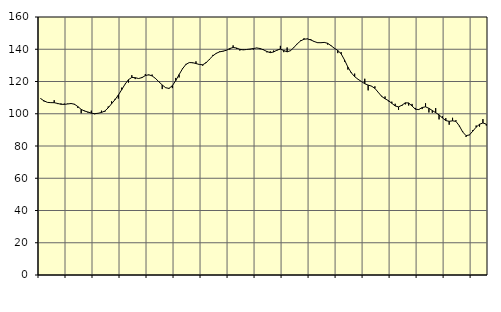
| Category | Piggar | Series 1 |
|---|---|---|
| nan | 109.6 | 109.36 |
| 87.0 | 107.6 | 107.99 |
| 87.0 | 107 | 107.05 |
| 87.0 | 107 | 106.88 |
| nan | 108.4 | 106.86 |
| 88.0 | 106 | 106.39 |
| 88.0 | 106.4 | 105.88 |
| 88.0 | 106.3 | 105.81 |
| nan | 106.3 | 106.06 |
| 89.0 | 106.6 | 106.34 |
| 89.0 | 105.6 | 105.93 |
| 89.0 | 103.6 | 104.45 |
| nan | 100.3 | 102.7 |
| 90.0 | 101.9 | 101.67 |
| 90.0 | 100.7 | 101.09 |
| 90.0 | 101.9 | 100.37 |
| nan | 99.7 | 100.04 |
| 91.0 | 100.2 | 100.3 |
| 91.0 | 101.9 | 100.79 |
| 91.0 | 101.2 | 101.69 |
| nan | 104.5 | 103.66 |
| 92.0 | 107.7 | 106.22 |
| 92.0 | 109.2 | 108.7 |
| 92.0 | 109.4 | 111.6 |
| nan | 116.2 | 114.93 |
| 93.0 | 118.5 | 118.37 |
| 93.0 | 119.3 | 121.13 |
| 93.0 | 123.9 | 122.52 |
| nan | 121.5 | 122.36 |
| 94.0 | 121.9 | 121.84 |
| 94.0 | 122.8 | 122.42 |
| 94.0 | 124.6 | 123.65 |
| nan | 123.9 | 124.18 |
| 95.0 | 124.3 | 123.46 |
| 95.0 | 122.1 | 121.9 |
| 95.0 | 120.1 | 119.84 |
| nan | 115.3 | 117.86 |
| 96.0 | 116.3 | 116.16 |
| 96.0 | 115.4 | 115.72 |
| 96.0 | 115.9 | 117.42 |
| nan | 122.2 | 120.57 |
| 97.0 | 122.5 | 124.3 |
| 97.0 | 128.2 | 127.85 |
| 97.0 | 130.9 | 130.55 |
| nan | 131.7 | 131.74 |
| 98.0 | 131.4 | 131.66 |
| 98.0 | 132.5 | 131.15 |
| 98.0 | 130.6 | 130.54 |
| nan | 129.8 | 130.38 |
| 99.0 | 132.1 | 131.62 |
| 99.0 | 133.5 | 133.83 |
| 99.0 | 136.5 | 135.92 |
| nan | 137.2 | 137.48 |
| 0.0 | 138.7 | 138.39 |
| 0.0 | 138.6 | 138.81 |
| 0.0 | 139.5 | 139.37 |
| nan | 139.8 | 140.42 |
| 1.0 | 142.4 | 141.12 |
| 1.0 | 140.2 | 140.77 |
| 1.0 | 139.2 | 139.95 |
| nan | 140 | 139.63 |
| 2.0 | 139.8 | 139.86 |
| 2.0 | 139.9 | 140.11 |
| 2.0 | 139.8 | 140.46 |
| nan | 140.9 | 140.78 |
| 3.0 | 140 | 140.46 |
| 3.0 | 140 | 139.64 |
| 3.0 | 138.1 | 138.61 |
| nan | 138.7 | 137.9 |
| 4.0 | 139.2 | 138.3 |
| 4.0 | 139.2 | 139.49 |
| 4.0 | 142.1 | 140.1 |
| nan | 138.2 | 139.23 |
| 5.0 | 141.1 | 138.39 |
| 5.0 | 139.3 | 139.11 |
| 5.0 | 141.3 | 141.09 |
| nan | 143.2 | 143.38 |
| 6.0 | 145.5 | 145.17 |
| 6.0 | 146.8 | 146.24 |
| 6.0 | 146.6 | 146.41 |
| nan | 146.3 | 145.78 |
| 7.0 | 144.6 | 144.82 |
| 7.0 | 143.9 | 144.08 |
| 7.0 | 144.2 | 144.05 |
| nan | 144 | 144.25 |
| 8.0 | 142.9 | 143.69 |
| 8.0 | 142 | 142.22 |
| 8.0 | 140.4 | 140.6 |
| nan | 137.6 | 139.29 |
| 9.0 | 138.2 | 137.16 |
| 9.0 | 132.3 | 133.35 |
| 9.0 | 127.4 | 128.92 |
| nan | 125.8 | 125.42 |
| 10.0 | 124.9 | 123.02 |
| 10.0 | 121.3 | 121.39 |
| 10.0 | 120 | 120 |
| nan | 121.7 | 118.62 |
| 11.0 | 114.5 | 117.77 |
| 11.0 | 117 | 117.14 |
| 11.0 | 117 | 115.72 |
| nan | 113.4 | 113.26 |
| 12.0 | 111.1 | 110.76 |
| 12.0 | 110.7 | 109.3 |
| 12.0 | 107.7 | 108.14 |
| nan | 107.5 | 106.5 |
| 13.0 | 106.2 | 104.83 |
| 13.0 | 102.4 | 104.26 |
| 13.0 | 104.8 | 105.29 |
| nan | 105.8 | 106.78 |
| 14.0 | 105.1 | 106.69 |
| 14.0 | 106.1 | 104.79 |
| 14.0 | 103.6 | 102.81 |
| nan | 102.4 | 102.6 |
| 15.0 | 102.9 | 103.86 |
| 15.0 | 106.5 | 104.3 |
| 15.0 | 100.8 | 103.37 |
| nan | 100.6 | 102 |
| 16.0 | 103.5 | 100.67 |
| 16.0 | 96.5 | 99.32 |
| 16.0 | 98.4 | 97.41 |
| nan | 97.3 | 95.75 |
| 17.0 | 93.2 | 95.31 |
| 17.0 | 97.5 | 95.62 |
| 17.0 | 96 | 95.27 |
| nan | 92.2 | 92.52 |
| 18.0 | 89.1 | 88.71 |
| 18.0 | 85.6 | 86.42 |
| 18.0 | 86.7 | 86.87 |
| nan | 89.9 | 89.21 |
| 19.0 | 92.7 | 91.7 |
| 19.0 | 92 | 93.48 |
| 19.0 | 96.7 | 94.29 |
| nan | 92.7 | 93.54 |